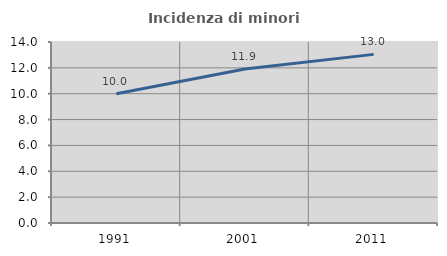
| Category | Incidenza di minori stranieri |
|---|---|
| 1991.0 | 10 |
| 2001.0 | 11.905 |
| 2011.0 | 13.043 |